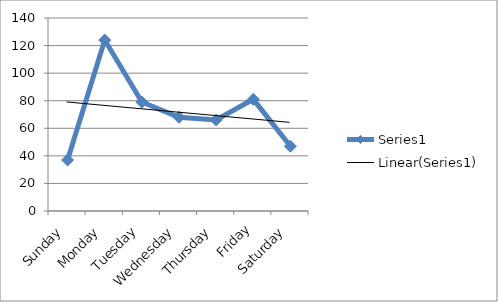
| Category | Series 0 |
|---|---|
| Sunday | 37 |
| Monday | 124 |
| Tuesday | 79 |
| Wednesday | 68 |
| Thursday | 66 |
| Friday | 81 |
| Saturday | 47 |